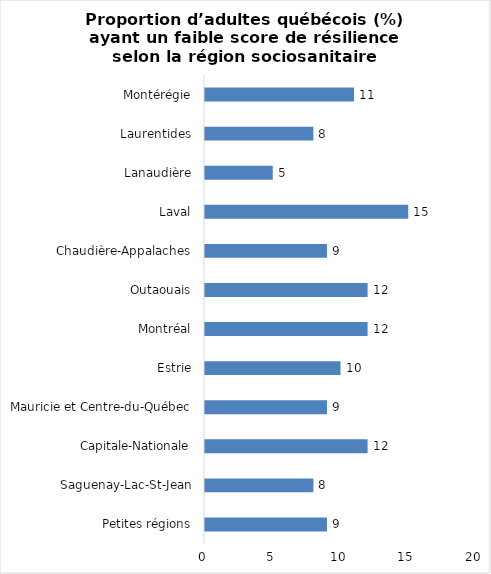
| Category | Series 0 |
|---|---|
| Petites régions | 9 |
| Saguenay-Lac-St-Jean | 8 |
| Capitale-Nationale | 12 |
| Mauricie et Centre-du-Québec | 9 |
| Estrie | 10 |
| Montréal | 12 |
| Outaouais | 12 |
| Chaudière-Appalaches | 9 |
| Laval | 15 |
| Lanaudière | 5 |
| Laurentides | 8 |
| Montérégie | 11 |